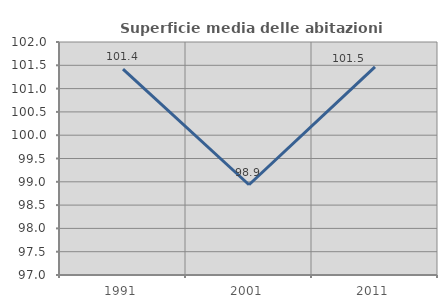
| Category | Superficie media delle abitazioni occupate |
|---|---|
| 1991.0 | 101.419 |
| 2001.0 | 98.937 |
| 2011.0 | 101.465 |